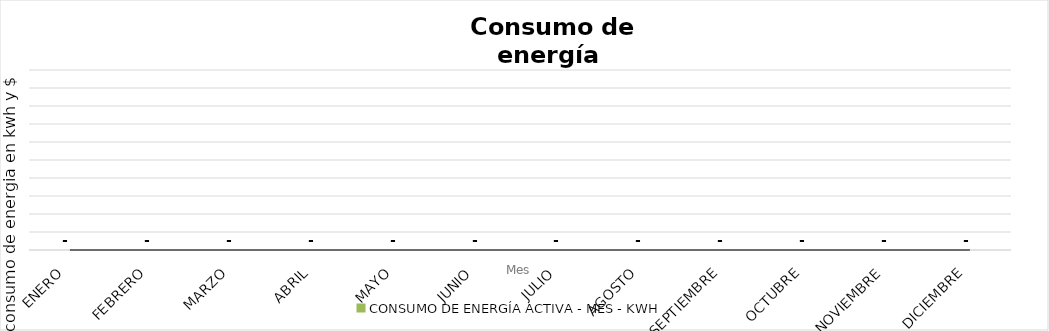
| Category | CONSUMO DE ENERGÍA ACTIVA - MES - KWH |
|---|---|
| ENERO | 0 |
| FEBRERO | 0 |
| MARZO | 0 |
| ABRIL | 0 |
| MAYO | 0 |
| JUNIO | 0 |
| JULIO | 0 |
| AGOSTO | 0 |
| SEPTIEMBRE | 0 |
| OCTUBRE | 0 |
| NOVIEMBRE | 0 |
| DICIEMBRE | 0 |